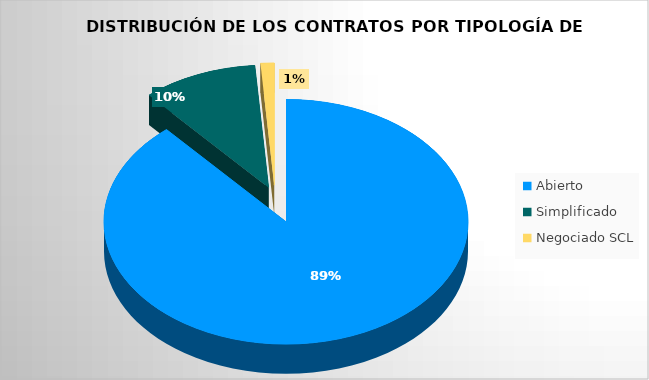
| Category | Importe adjudicado | Porcentaje |
|---|---|---|
| Abierto  | 7064705.9 | 0.886 |
| Simplificado | 812964.32 | 0.102 |
| Negociado SCL | 96396.58 | 0.012 |